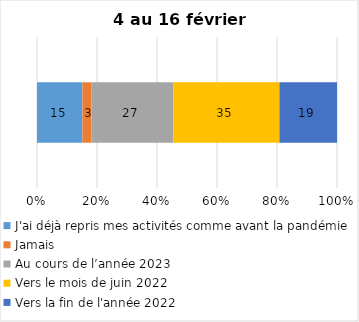
| Category | J'ai déjà repris mes activités comme avant la pandémie | Jamais | Au cours de l’année 2023 | Vers le mois de juin 2022 | Vers la fin de l'année 2022 |
|---|---|---|---|---|---|
| 0 | 15 | 3 | 27 | 35 | 19 |